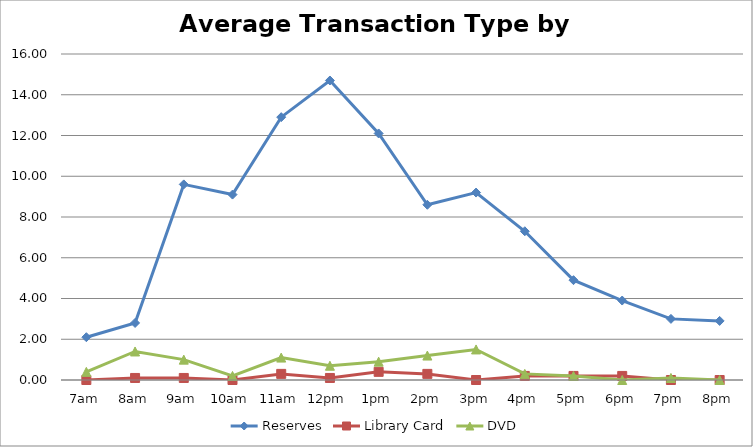
| Category | Reserves | Library Card | DVD |
|---|---|---|---|
| 7am | 2.1 | 0 | 0.4 |
| 8am | 2.8 | 0.1 | 1.4 |
| 9am | 9.6 | 0.1 | 1 |
| 10am | 9.1 | 0 | 0.2 |
| 11am | 12.9 | 0.3 | 1.1 |
| 12pm | 14.7 | 0.1 | 0.7 |
| 1pm | 12.1 | 0.4 | 0.9 |
| 2pm | 8.6 | 0.3 | 1.2 |
| 3pm | 9.2 | 0 | 1.5 |
| 4pm | 7.3 | 0.2 | 0.3 |
| 5pm | 4.9 | 0.2 | 0.2 |
| 6pm | 3.9 | 0.2 | 0 |
| 7pm | 3 | 0 | 0.1 |
| 8pm | 2.9 | 0 | 0 |